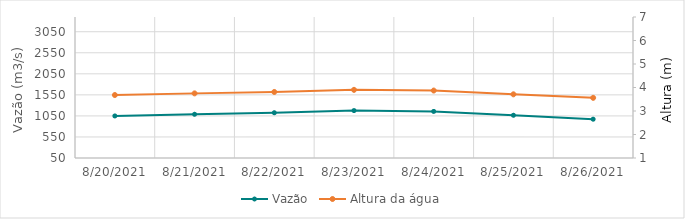
| Category | Vazão |
|---|---|
| 6/6/21 | 3111.95 |
| 6/5/21 | 3178.63 |
| 6/4/21 | 3232.52 |
| 6/3/21 | 3221.12 |
| 6/2/21 | 3142.4 |
| 6/1/21 | 2993.93 |
| 5/31/21 | 2860.66 |